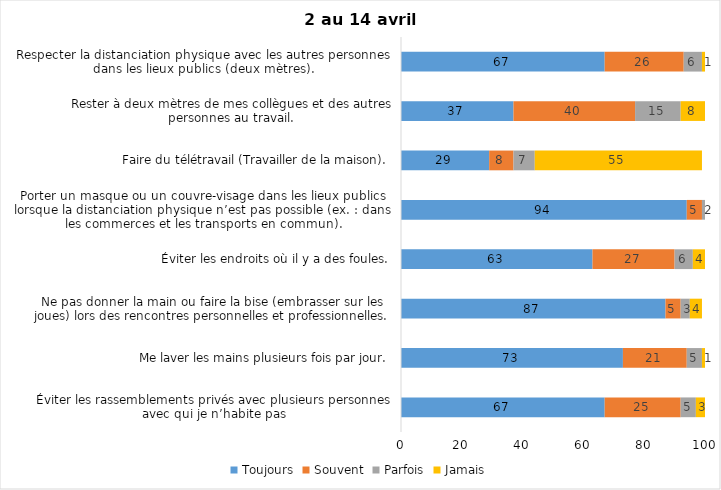
| Category | Toujours | Souvent | Parfois | Jamais |
|---|---|---|---|---|
| Éviter les rassemblements privés avec plusieurs personnes avec qui je n’habite pas | 67 | 25 | 5 | 3 |
| Me laver les mains plusieurs fois par jour. | 73 | 21 | 5 | 1 |
| Ne pas donner la main ou faire la bise (embrasser sur les joues) lors des rencontres personnelles et professionnelles. | 87 | 5 | 3 | 4 |
| Éviter les endroits où il y a des foules. | 63 | 27 | 6 | 4 |
| Porter un masque ou un couvre-visage dans les lieux publics lorsque la distanciation physique n’est pas possible (ex. : dans les commerces et les transports en commun). | 94 | 5 | 2 | 0 |
| Faire du télétravail (Travailler de la maison). | 29 | 8 | 7 | 55 |
| Rester à deux mètres de mes collègues et des autres personnes au travail. | 37 | 40 | 15 | 8 |
| Respecter la distanciation physique avec les autres personnes dans les lieux publics (deux mètres). | 67 | 26 | 6 | 1 |